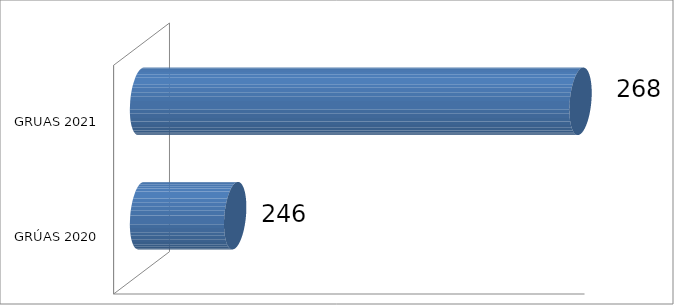
| Category | NOVIEMBRE |
|---|---|
| GRÚAS 2020 | 246 |
| GRUAS 2021 | 268 |